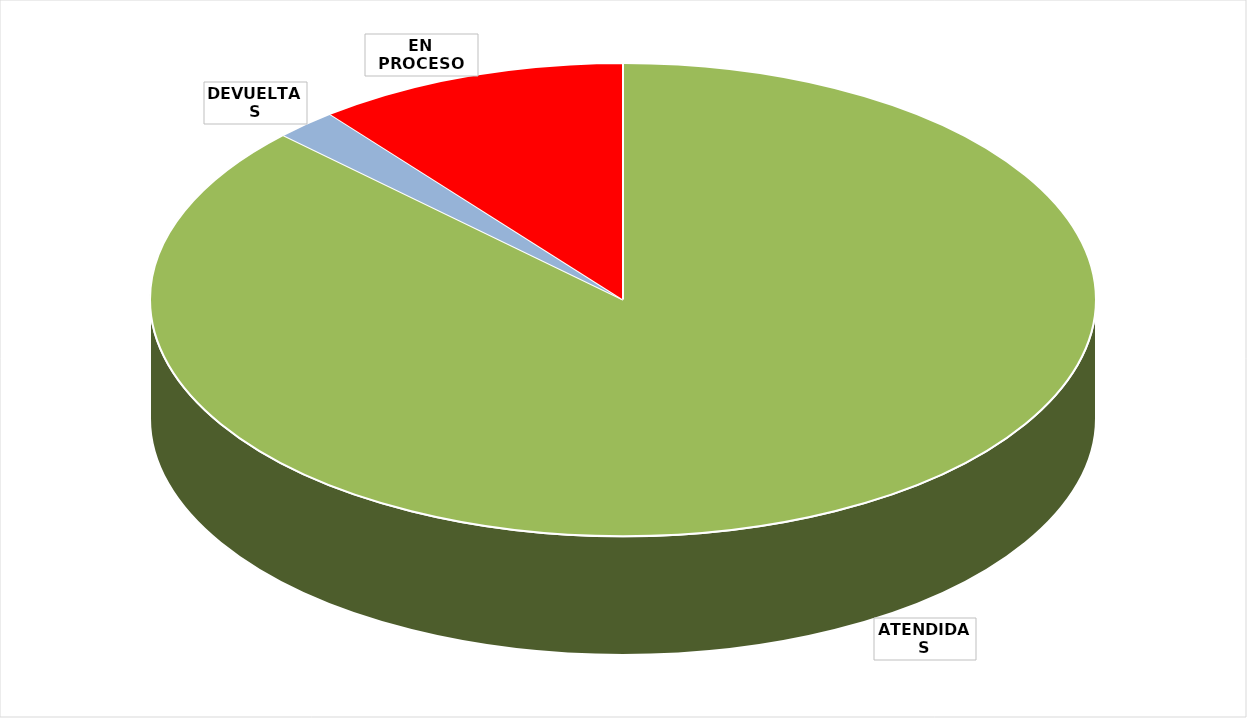
| Category | TOTAL |
|---|---|
| ATENDIDAS | 41 |
| DEVUELTAS | 1 |
| EN PROCESO | 5 |